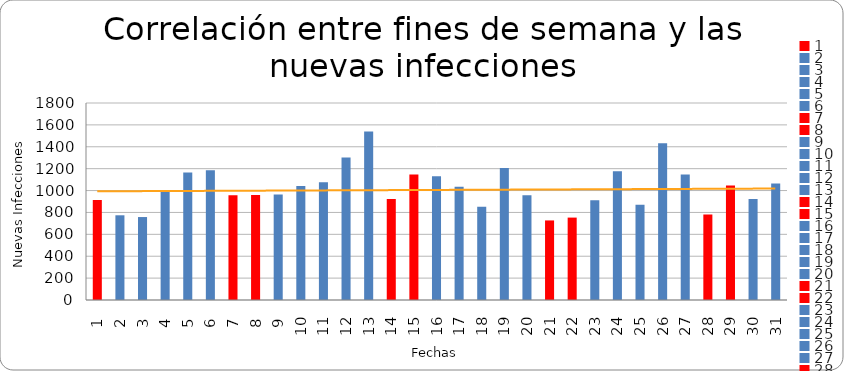
| Category | Casos del Día |
|---|---|
| 1.0 | 913 |
| 2.0 | 774 |
| 3.0 | 758 |
| 4.0 | 988 |
| 5.0 | 1166 |
| 6.0 | 1185 |
| 7.0 | 957 |
| 8.0 | 960 |
| 9.0 | 965 |
| 10.0 | 1041 |
| 11.0 | 1075 |
| 12.0 | 1301 |
| 13.0 | 1540 |
| 14.0 | 923 |
| 15.0 | 1147 |
| 16.0 | 1130 |
| 17.0 | 1035 |
| 18.0 | 853 |
| 19.0 | 1207 |
| 20.0 | 958 |
| 21.0 | 727 |
| 22.0 | 753 |
| 23.0 | 911 |
| 24.0 | 1176 |
| 25.0 | 871 |
| 26.0 | 1432 |
| 27.0 | 1146 |
| 28.0 | 781 |
| 29.0 | 1046 |
| 30.0 | 922 |
| 31.0 | 1065 |